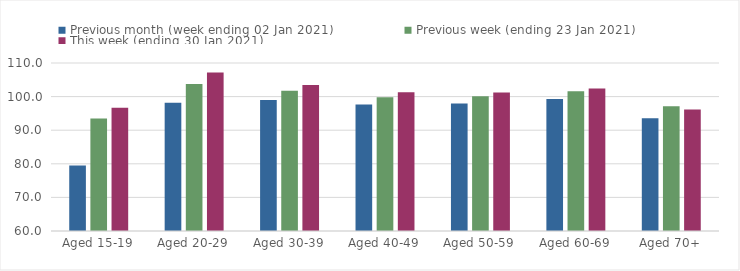
| Category | Previous month (week ending 02 Jan 2021) | Previous week (ending 23 Jan 2021) | This week (ending 30 Jan 2021) |
|---|---|---|---|
| Aged 15-19 | 79.51 | 93.5 | 96.68 |
| Aged 20-29 | 98.2 | 103.78 | 107.14 |
| Aged 30-39 | 99.01 | 101.74 | 103.45 |
| Aged 40-49 | 97.62 | 99.81 | 101.28 |
| Aged 50-59 | 97.92 | 100.11 | 101.23 |
| Aged 60-69 | 99.27 | 101.57 | 102.4 |
| Aged 70+ | 93.57 | 97.14 | 96.16 |